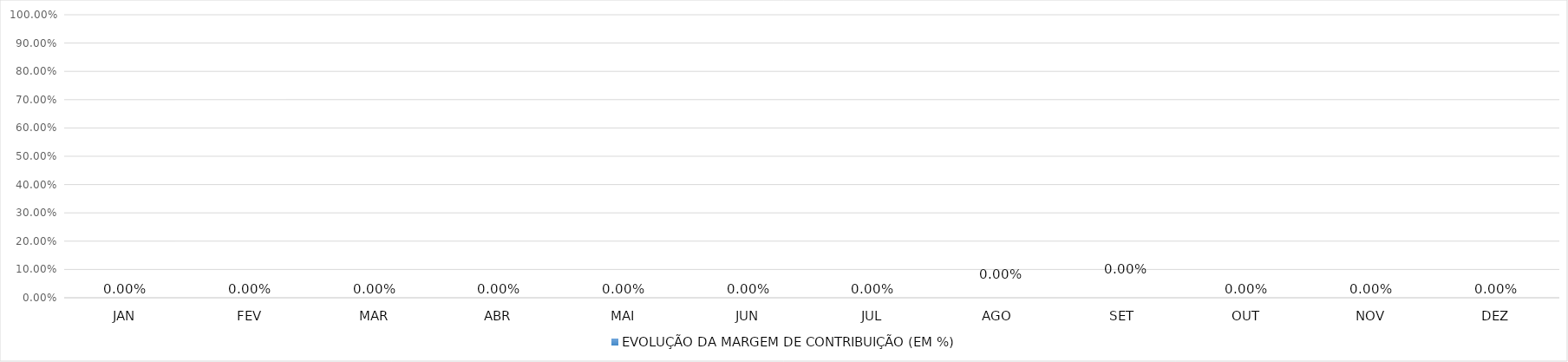
| Category | EVOLUÇÃO DA MARGEM DE CONTRIBUIÇÃO (EM %) |
|---|---|
| JAN | 0 |
| FEV | 0 |
| MAR | 0 |
| ABR | 0 |
| MAI | 0 |
| JUN | 0 |
| JUL | 0 |
| AGO | 0 |
| SET | 0 |
| OUT | 0 |
| NOV | 0 |
| DEZ | 0 |